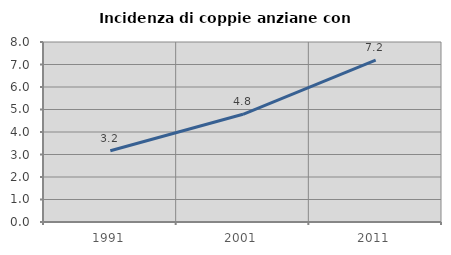
| Category | Incidenza di coppie anziane con figli |
|---|---|
| 1991.0 | 3.167 |
| 2001.0 | 4.787 |
| 2011.0 | 7.19 |